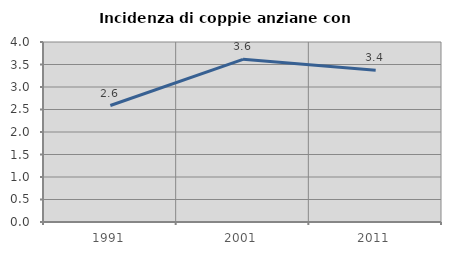
| Category | Incidenza di coppie anziane con figli |
|---|---|
| 1991.0 | 2.588 |
| 2001.0 | 3.615 |
| 2011.0 | 3.373 |